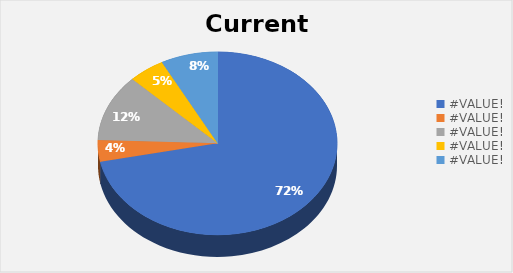
| Category | Current Investment |
|---|---|
| AMAZON.COM, INC. (XNAS:AMZN) | 14000 |
| UNITED PARCEL SERVICE, INC. (XNYS:UPS) | 750 |
| MICROSOFT CORPORATION (XNAS:MSFT) | 2300 |
| THE BOEING COMPANY (XNYS:BA) | 960 |
| APPLE INC. (XNAS:AAPL) | 1500 |